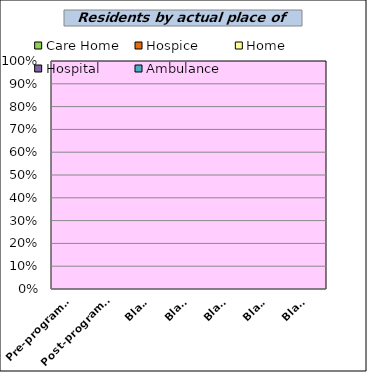
| Category | Care Home | Hospice | Home | Hospital | Ambulance  |
|---|---|---|---|---|---|
| Pre-programme | 0 | 0 | 0 | 0 | 0 |
| Post-programme | 0 | 0 | 0 | 0 | 0 |
| Blank | 0 | 0 | 0 | 0 | 0 |
| Blank | 0 | 0 | 0 | 0 | 0 |
| Blank | 0 | 0 | 0 | 0 | 0 |
| Blank | 0 | 0 | 0 | 0 | 0 |
| Blank | 0 | 0 | 0 | 0 | 0 |